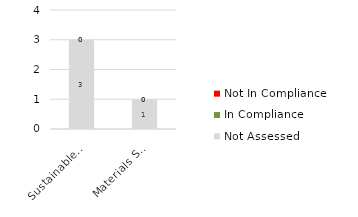
| Category | Not Assessed | In Compliance | Not In Compliance |
|---|---|---|---|
| Sustainable Sites | 3 | 0 | 0 |
| Materials Selection | 1 | 0 | 0 |